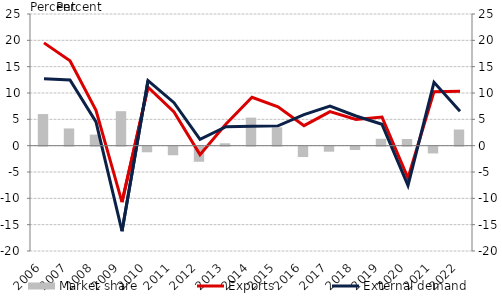
| Category | Market share |
|---|---|
| 2006.0 | 6.004 |
| 2007.0 | 3.269 |
| 2008.0 | 2.097 |
| 2009.0 | 6.547 |
| 2010.0 | -1.066 |
| 2011.0 | -1.63 |
| 2012.0 | -2.864 |
| 2013.0 | 0.459 |
| 2014.0 | 5.321 |
| 2015.0 | 3.47 |
| 2016.0 | -1.969 |
| 2017.0 | -0.955 |
| 2018.0 | -0.63 |
| 2019.0 | 1.308 |
| 2020.0 | 1.269 |
| 2021.0 | -1.289 |
| 2022.0 | 3.065 |